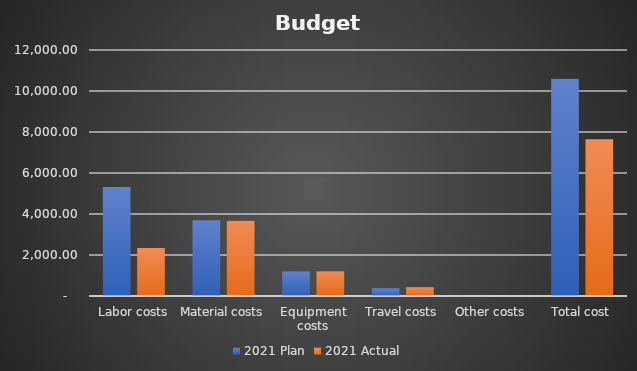
| Category | 2021 |
|---|---|
| Labor costs | 2345 |
| Material costs | 3668 |
| Equipment costs | 1200 |
| Travel costs | 430 |
| Other costs | 0 |
| Total cost | 7643 |